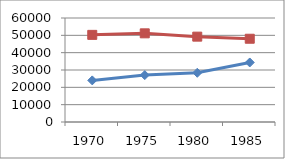
| Category | agrumi | frutta fresca |
|---|---|---|
| 1970.0 | 24001 | 50267 |
| 1975.0 | 27054 | 51148 |
| 1980.0 | 28400 | 49245 |
| 1985.0 | 34336 | 48033 |